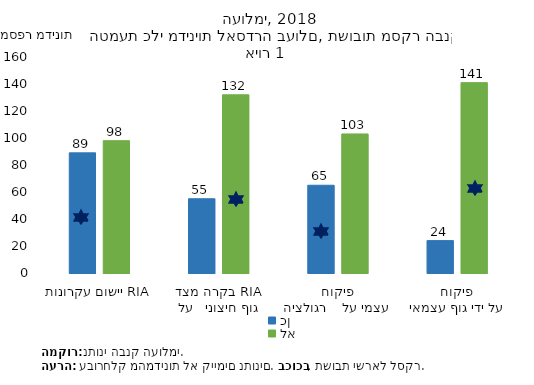
| Category | כן | לא |
|---|---|---|
| יישום עקרונות RIA | 89 | 98 |
| בקרה מצד גוף חיצוני   על RIA | 55 | 132 |
| פיקוח עצמי על    רגולציה | 65 | 103 |
| פיקוח על ידי גוף עצמאי | 24 | 141 |